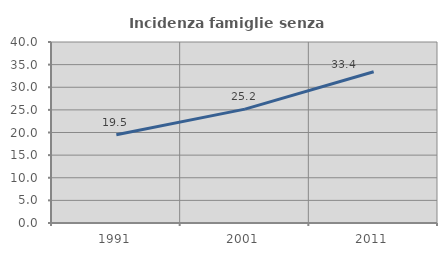
| Category | Incidenza famiglie senza nuclei |
|---|---|
| 1991.0 | 19.493 |
| 2001.0 | 25.167 |
| 2011.0 | 33.44 |